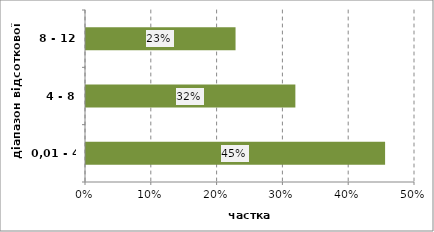
| Category | Series 0 |
|---|---|
| 0,01 - 4 | 0.455 |
| 4 - 8 | 0.318 |
| 8 - 12 | 0.227 |